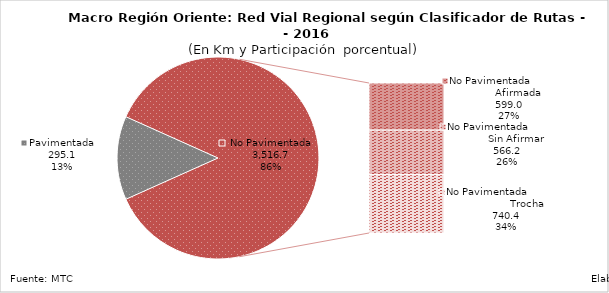
| Category | Series 0 |
|---|---|
| Pavimentada | 295.064 |
| No Pavimentada                   Afirmada | 599.015 |
| No Pavimentada                   Sin Afirmar | 566.182 |
| No Pavimentada                            Trocha | 740.362 |